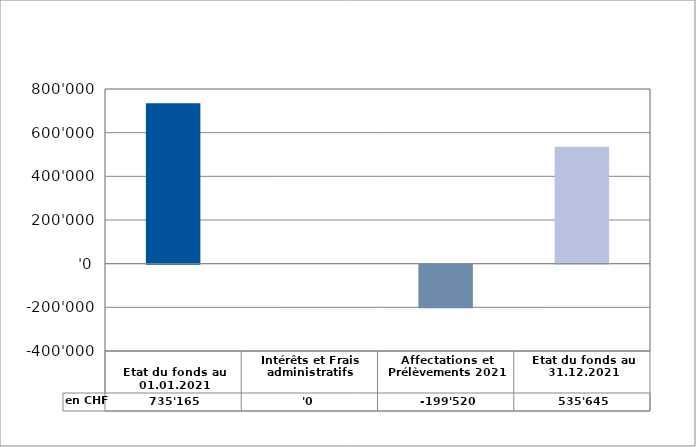
| Category | en CHF |
|---|---|
| 
Etat du fonds au 01.01.2021

 | 735165 |
| Intérêts et Frais administratifs | 0 |
| Affectations et Prélèvements 2021 | -199520 |
| Etat du fonds au 31.12.2021 | 535645 |